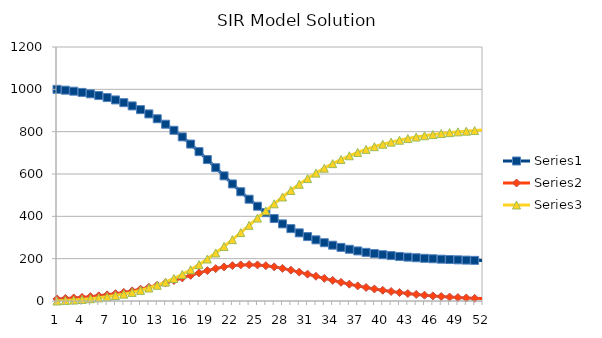
| Category | Series 0 | Series 1 | Series 2 |
|---|---|---|---|
| 0 | 1000 | 10 | 0 |
| 1 | 996 | 12 | 2 |
| 2 | 991.219 | 14.381 | 4.4 |
| 3 | 985.517 | 17.206 | 7.276 |
| 4 | 978.734 | 20.548 | 10.717 |
| 5 | 970.69 | 24.483 | 14.827 |
| 6 | 961.184 | 29.092 | 19.724 |
| 7 | 949.999 | 34.459 | 25.542 |
| 8 | 936.904 | 40.662 | 32.434 |
| 9 | 921.666 | 47.768 | 40.566 |
| 10 | 904.055 | 55.825 | 50.12 |
| 11 | 883.868 | 64.847 | 61.285 |
| 12 | 860.941 | 74.804 | 74.254 |
| 13 | 835.18 | 85.604 | 89.215 |
| 14 | 806.582 | 97.082 | 106.336 |
| 15 | 775.26 | 108.987 | 125.753 |
| 16 | 741.463 | 120.987 | 147.55 |
| 17 | 705.58 | 132.673 | 171.747 |
| 18 | 668.136 | 143.582 | 198.282 |
| 19 | 629.763 | 153.239 | 226.998 |
| 20 | 591.161 | 161.193 | 257.646 |
| 21 | 553.045 | 167.071 | 289.885 |
| 22 | 516.086 | 170.616 | 323.299 |
| 23 | 480.865 | 171.713 | 357.422 |
| 24 | 447.836 | 170.399 | 391.765 |
| 25 | 417.312 | 166.844 | 425.844 |
| 26 | 389.462 | 161.325 | 459.213 |
| 27 | 364.33 | 154.192 | 491.478 |
| 28 | 341.859 | 145.824 | 522.317 |
| 29 | 321.918 | 136.6 | 551.482 |
| 30 | 304.329 | 126.87 | 578.802 |
| 31 | 288.885 | 116.94 | 604.175 |
| 32 | 275.372 | 107.065 | 627.563 |
| 33 | 263.579 | 97.445 | 648.976 |
| 34 | 253.305 | 88.23 | 668.465 |
| 35 | 244.365 | 79.523 | 686.111 |
| 36 | 236.592 | 71.392 | 702.016 |
| 37 | 229.836 | 63.87 | 716.294 |
| 38 | 223.964 | 56.968 | 729.068 |
| 39 | 218.861 | 50.678 | 740.462 |
| 40 | 214.424 | 44.979 | 750.597 |
| 41 | 210.566 | 39.841 | 759.593 |
| 42 | 207.211 | 35.228 | 767.561 |
| 43 | 204.291 | 31.102 | 774.607 |
| 44 | 201.749 | 27.423 | 780.827 |
| 45 | 199.536 | 24.152 | 786.312 |
| 46 | 197.609 | 21.249 | 791.142 |
| 47 | 195.929 | 18.679 | 795.392 |
| 48 | 194.465 | 16.407 | 799.128 |
| 49 | 193.189 | 14.402 | 802.409 |
| 50 | 192.076 | 12.634 | 805.29 |
| 51 | 191.105 | 11.078 | 807.816 |